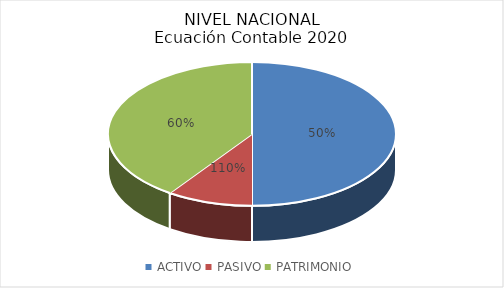
| Category | Series 0 |
|---|---|
| ACTIVO | 696125147435.741 |
| PASIVO | 1526706651553.98 |
| PATRIMONIO | -830581504118.24 |